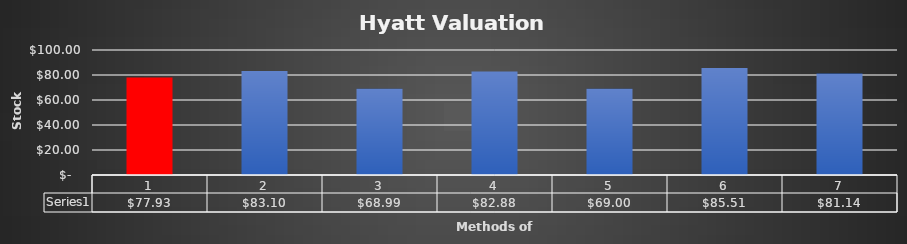
| Category | Series 0 |
|---|---|
| 0 | 77.93 |
| 1 | 83.104 |
| 2 | 68.99 |
| 3 | 82.884 |
| 4 | 68.995 |
| 5 | 85.507 |
| 6 | 81.144 |